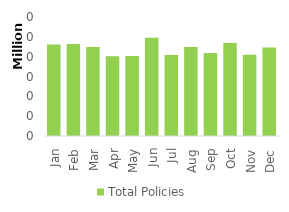
| Category | Total Policies |
|---|---|
| Jan | 92211 |
| Feb | 92705 |
| Mar | 89867 |
| Apr | 80435 |
| May | 80629 |
| Jun | 99159 |
| Jul | 81806 |
| Aug | 89826 |
| Sep | 83644 |
| Oct | 93683 |
| Nov | 81934 |
| Dec | 89345 |